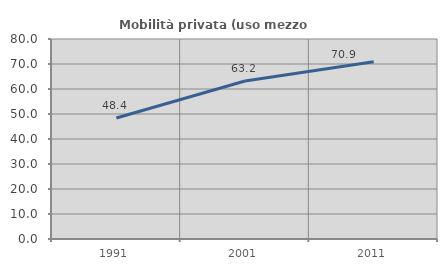
| Category | Mobilità privata (uso mezzo privato) |
|---|---|
| 1991.0 | 48.397 |
| 2001.0 | 63.179 |
| 2011.0 | 70.941 |